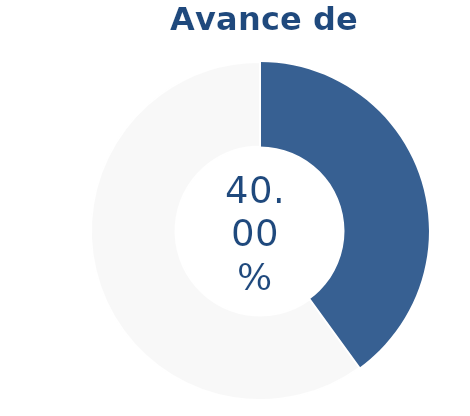
| Category | Series 0 |
|---|---|
| Acumulado 1 Trimestre | 0.4 |
| Año | -0.6 |